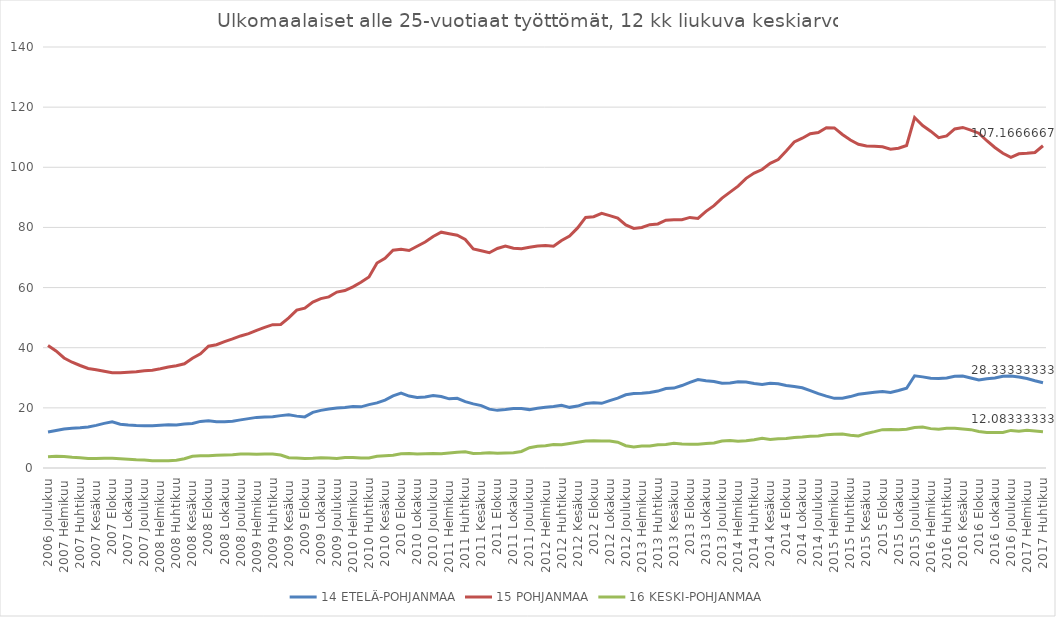
| Category | 14 ETELÄ-POHJANMAA | 15 POHJANMAA | 16 KESKI-POHJANMAA |
|---|---|---|---|
| 2006 Joulukuu | 12 | 40.75 | 3.75 |
| 2007 Tammikuu | 12.5 | 38.917 | 3.917 |
| 2007 Helmikuu | 13 | 36.583 | 3.833 |
| 2007 Maaliskuu | 13.25 | 35.167 | 3.583 |
| 2007 Huhtikuu | 13.417 | 34.083 | 3.417 |
| 2007 Toukokuu | 13.667 | 33.083 | 3.167 |
| 2007 Kesäkuu | 14.167 | 32.667 | 3.167 |
| 2007 Heinäkuu | 14.833 | 32.167 | 3.25 |
| 2007 Elokuu | 15.333 | 31.667 | 3.25 |
| 2007 Syyskuu | 14.583 | 31.667 | 3.083 |
| 2007 Lokakuu | 14.333 | 31.833 | 2.917 |
| 2007 Marraskuu | 14.167 | 32 | 2.75 |
| 2007 Joulukuu | 14.083 | 32.333 | 2.667 |
| 2008 Tammikuu | 14.083 | 32.5 | 2.417 |
| 2008 Helmikuu | 14.25 | 33 | 2.417 |
| 2008 Maaliskuu | 14.417 | 33.583 | 2.417 |
| 2008 Huhtikuu | 14.333 | 34 | 2.583 |
| 2008 Toukokuu | 14.667 | 34.667 | 3.083 |
| 2008 Kesäkuu | 14.833 | 36.5 | 3.917 |
| 2008 Heinäkuu | 15.5 | 38 | 4.083 |
| 2008 Elokuu | 15.75 | 40.5 | 4.083 |
| 2008 Syyskuu | 15.417 | 41 | 4.25 |
| 2008 Lokakuu | 15.417 | 42 | 4.333 |
| 2008 Marraskuu | 15.583 | 42.917 | 4.417 |
| 2008 Joulukuu | 16 | 43.917 | 4.667 |
| 2009 Tammikuu | 16.417 | 44.667 | 4.667 |
| 2009 Helmikuu | 16.833 | 45.75 | 4.583 |
| 2009 Maaliskuu | 17 | 46.75 | 4.667 |
| 2009 Huhtikuu | 17.083 | 47.667 | 4.667 |
| 2009 Toukokuu | 17.417 | 47.75 | 4.333 |
| 2009 Kesäkuu | 17.667 | 49.917 | 3.417 |
| 2009 Heinäkuu | 17.25 | 52.5 | 3.333 |
| 2009 Elokuu | 17 | 53.167 | 3.167 |
| 2009 Syyskuu | 18.5 | 55.167 | 3.25 |
| 2009 Lokakuu | 19.167 | 56.333 | 3.417 |
| 2009 Marraskuu | 19.583 | 56.917 | 3.333 |
| 2009 Joulukuu | 19.917 | 58.5 | 3.167 |
| 2010 Tammikuu | 20.083 | 59 | 3.5 |
| 2010 Helmikuu | 20.417 | 60.25 | 3.5 |
| 2010 Maaliskuu | 20.333 | 61.75 | 3.333 |
| 2010 Huhtikuu | 21.083 | 63.5 | 3.333 |
| 2010 Toukokuu | 21.667 | 68.167 | 3.917 |
| 2010 Kesäkuu | 22.583 | 69.75 | 4.083 |
| 2010 Heinäkuu | 24 | 72.417 | 4.25 |
| 2010 Elokuu | 24.917 | 72.75 | 4.75 |
| 2010 Syyskuu | 23.917 | 72.333 | 4.833 |
| 2010 Lokakuu | 23.417 | 73.75 | 4.667 |
| 2010 Marraskuu | 23.583 | 75.167 | 4.75 |
| 2010 Joulukuu | 24.083 | 77 | 4.833 |
| 2011 Tammikuu | 23.75 | 78.417 | 4.75 |
| 2011 Helmikuu | 23 | 77.917 | 5 |
| 2011 Maaliskuu | 23.167 | 77.417 | 5.25 |
| 2011 Huhtikuu | 22.083 | 76 | 5.417 |
| 2011 Toukokuu | 21.333 | 72.833 | 4.833 |
| 2011 Kesäkuu | 20.75 | 72.25 | 4.917 |
| 2011 Heinäkuu | 19.583 | 71.583 | 5.083 |
| 2011 Elokuu | 19.167 | 73 | 4.917 |
| 2011 Syyskuu | 19.417 | 73.833 | 5 |
| 2011 Lokakuu | 19.75 | 73.083 | 5.083 |
| 2011 Marraskuu | 19.75 | 72.917 | 5.5 |
| 2011 Joulukuu | 19.417 | 73.417 | 6.75 |
| 2012 Tammikuu | 19.833 | 73.833 | 7.25 |
| 2012 Helmikuu | 20.167 | 74 | 7.417 |
| 2012 Maaliskuu | 20.417 | 73.75 | 7.833 |
| 2012 Huhtikuu | 20.833 | 75.667 | 7.75 |
| 2012 Toukokuu | 20.167 | 77.167 | 8.167 |
| 2012 Kesäkuu | 20.583 | 79.833 | 8.583 |
| 2012 Heinäkuu | 21.417 | 83.333 | 9 |
| 2012 Elokuu | 21.667 | 83.583 | 9.083 |
| 2012 Syyskuu | 21.5 | 84.667 | 9 |
| 2012 Lokakuu | 22.417 | 83.917 | 9 |
| 2012 Marraskuu | 23.25 | 83.083 | 8.583 |
| 2012 Joulukuu | 24.333 | 80.833 | 7.417 |
| 2013 Tammikuu | 24.75 | 79.667 | 7 |
| 2013 Helmikuu | 24.833 | 80 | 7.333 |
| 2013 Maaliskuu | 25.083 | 80.917 | 7.333 |
| 2013 Huhtikuu | 25.583 | 81.167 | 7.75 |
| 2013 Toukokuu | 26.417 | 82.417 | 7.833 |
| 2013 Kesäkuu | 26.583 | 82.583 | 8.25 |
| 2013 Heinäkuu | 27.417 | 82.583 | 8 |
| 2013 Elokuu | 28.5 | 83.333 | 7.917 |
| 2013 Syyskuu | 29.417 | 83 | 7.917 |
| 2013 Lokakuu | 29 | 85.333 | 8.167 |
| 2013 Marraskuu | 28.75 | 87.25 | 8.333 |
| 2013 Joulukuu | 28.167 | 89.75 | 9 |
| 2014 Tammikuu | 28.25 | 91.75 | 9.167 |
| 2014 Helmikuu | 28.667 | 93.75 | 8.917 |
| 2014 Maaliskuu | 28.583 | 96.333 | 9.083 |
| 2014 Huhtikuu | 28.083 | 98.083 | 9.417 |
| 2014 Toukokuu | 27.75 | 99.25 | 9.917 |
| 2014 Kesäkuu | 28.167 | 101.333 | 9.5 |
| 2014 Heinäkuu | 28 | 102.583 | 9.75 |
| 2014 Elokuu | 27.417 | 105.417 | 9.833 |
| 2014 Syyskuu | 27.083 | 108.417 | 10.167 |
| 2014 Lokakuu | 26.667 | 109.667 | 10.333 |
| 2014 Marraskuu | 25.75 | 111.167 | 10.583 |
| 2014 Joulukuu | 24.75 | 111.583 | 10.667 |
| 2015 Tammikuu | 23.917 | 113.167 | 11.083 |
| 2015 Helmikuu | 23.167 | 113.083 | 11.25 |
| 2015 Maaliskuu | 23.167 | 110.917 | 11.333 |
| 2015 Huhtikuu | 23.75 | 109.083 | 10.917 |
| 2015 Toukokuu | 24.5 | 107.667 | 10.667 |
| 2015 Kesäkuu | 24.833 | 107.083 | 11.5 |
| 2015 Heinäkuu | 25.167 | 107 | 12.083 |
| 2015 Elokuu | 25.417 | 106.833 | 12.75 |
| 2015 Syyskuu | 25.083 | 106 | 12.833 |
| 2015 Lokakuu | 25.75 | 106.333 | 12.75 |
| 2015 Marraskuu | 26.5 | 107.25 | 12.917 |
| 2015 Joulukuu | 30.667 | 116.556 | 13.444 |
| 2016 Tammikuu | 30.3 | 113.9 | 13.6 |
| 2016 Helmikuu | 29.818 | 112 | 13.091 |
| 2016 Maaliskuu | 29.75 | 109.833 | 12.917 |
| 2016 Huhtikuu | 29.917 | 110.417 | 13.25 |
| 2016 Toukokuu | 30.5 | 112.75 | 13.25 |
| 2016 Kesäkuu | 30.583 | 113.25 | 13 |
| 2016 Heinäkuu | 29.917 | 112.333 | 12.75 |
| 2016 Elokuu | 29.25 | 111.333 | 12.167 |
| 2016 Syyskuu | 29.667 | 108.833 | 11.833 |
| 2016 Lokakuu | 29.917 | 106.583 | 11.833 |
| 2016 Marraskuu | 30.5 | 104.667 | 11.833 |
| 2016 Joulukuu | 30.583 | 103.333 | 12.5 |
| 2017 Tammikuu | 30.25 | 104.5 | 12.25 |
| 2017 Helmikuu | 29.75 | 104.667 | 12.583 |
| 2017 Maaliskuu | 29 | 104.917 | 12.333 |
| 2017 Huhtikuu | 28.333 | 107.167 | 12.083 |